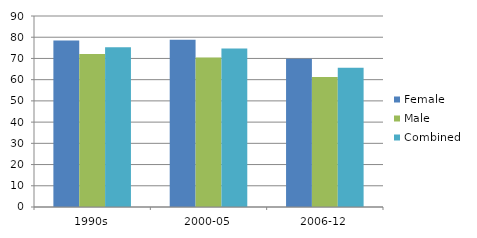
| Category | Female | Male | Combined |
|---|---|---|---|
| 1990s | 78.5 | 72.1 | 75.3 |
| 2000-05 | 78.8 | 70.5 | 74.7 |
| 2006-12 | 69.9 | 61.3 | 65.6 |